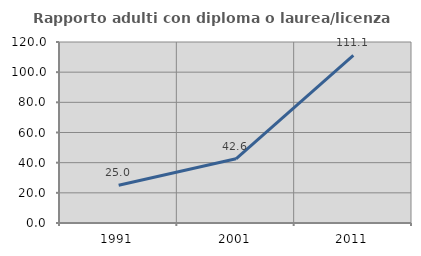
| Category | Rapporto adulti con diploma o laurea/licenza media  |
|---|---|
| 1991.0 | 25 |
| 2001.0 | 42.553 |
| 2011.0 | 111.111 |